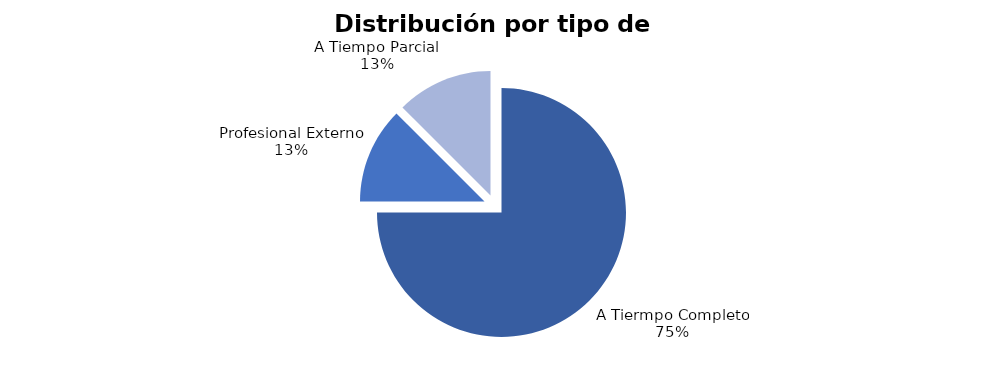
| Category | 12 |
|---|---|
| A Tiermpo Completo | 12 |
| Profesional Externo | 2 |
| A Tiempo Parcial | 2 |